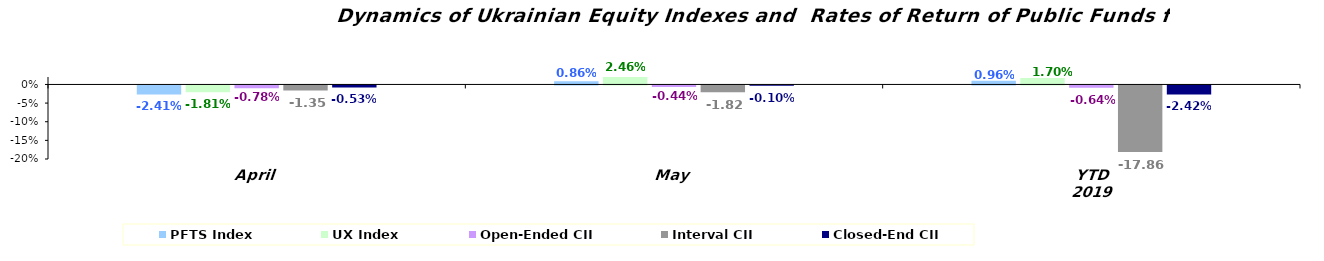
| Category | PFTS Index | UX Index | Open-Ended CII | Interval CII | Closed-End CII |
|---|---|---|---|---|---|
| April | -0.024 | -0.018 | -0.008 | -0.014 | -0.005 |
| May | 0.009 | 0.025 | -0.004 | -0.018 | -0.001 |
| YTD 2019 | 0.01 | 0.017 | -0.006 | -0.179 | -0.024 |